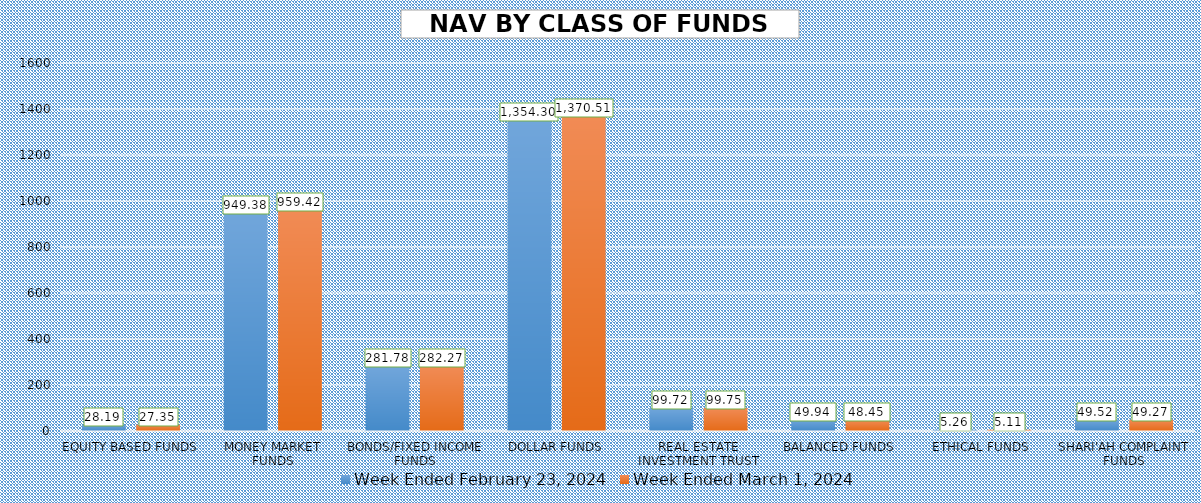
| Category | Week Ended February 23, 2024 | Week Ended March 1, 2024 |
|---|---|---|
| EQUITY BASED FUNDS | 28.192 | 27.345 |
| MONEY MARKET FUNDS | 949.383 | 959.42 |
| BONDS/FIXED INCOME FUNDS | 281.781 | 282.275 |
| DOLLAR FUNDS | 1354.299 | 1370.514 |
| REAL ESTATE INVESTMENT TRUST | 99.722 | 99.748 |
| BALANCED FUNDS | 49.943 | 48.445 |
| ETHICAL FUNDS | 5.257 | 5.112 |
| SHARI'AH COMPLAINT FUNDS | 49.521 | 49.268 |